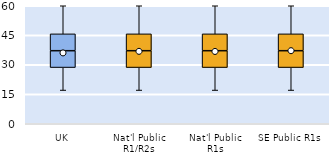
| Category | 25th | 50th | 75th |
|---|---|---|---|
| UK | 28.571 | 8.571 | 8.571 |
| Nat'l Public R1/R2s | 28.571 | 8.571 | 8.571 |
| Nat'l Public R1s | 28.571 | 8.571 | 8.571 |
| SE Public R1s | 28.571 | 8.571 | 8.571 |